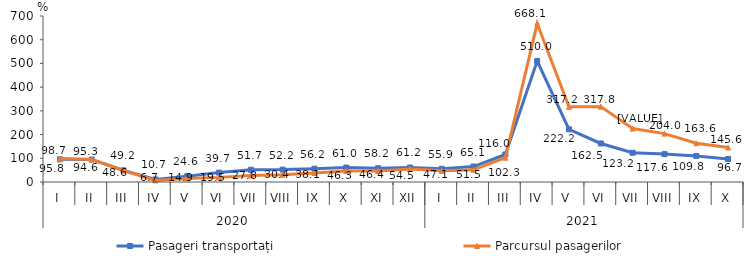
| Category | Pasageri transportați | Parcursul pasagerilor |
|---|---|---|
| 0 | 95.8 | 98.7 |
| 1 | 94.6 | 95.3 |
| 2 | 49.2 | 48.6 |
| 3 | 10.7 | 6.7 |
| 4 | 24.6 | 14.9 |
| 5 | 39.7 | 19.5 |
| 6 | 51.7 | 27.8 |
| 7 | 52.2 | 30.4 |
| 8 | 56.2 | 38.1 |
| 9 | 61 | 46.3 |
| 10 | 58.2 | 46.4 |
| 11 | 61.2 | 54.5 |
| 12 | 55.9 | 47.1 |
| 13 | 65.1 | 51.5 |
| 14 | 116 | 102.3 |
| 15 | 510 | 668.1 |
| 16 | 222.2 | 317.2 |
| 17 | 162.5 | 317.8 |
| 18 | 123.2 | 225.4 |
| 19 | 117.6 | 204 |
| 20 | 109.8 | 163.6 |
| 21 | 96.7 | 145.6 |